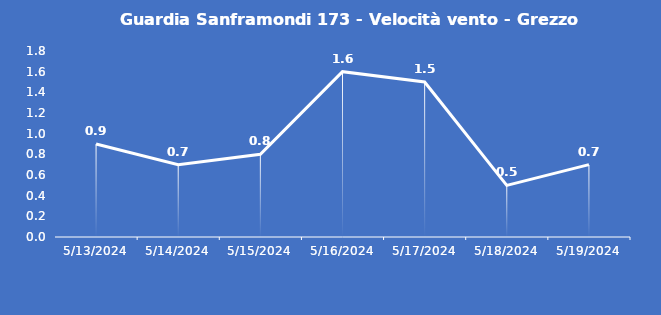
| Category | Guardia Sanframondi 173 - Velocità vento - Grezzo (m/s) |
|---|---|
| 5/13/24 | 0.9 |
| 5/14/24 | 0.7 |
| 5/15/24 | 0.8 |
| 5/16/24 | 1.6 |
| 5/17/24 | 1.5 |
| 5/18/24 | 0.5 |
| 5/19/24 | 0.7 |